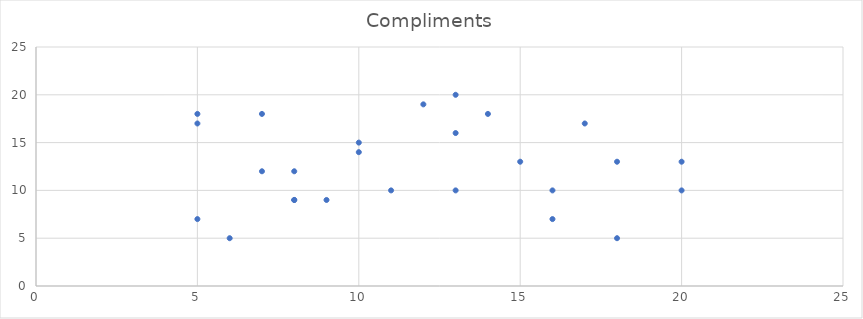
| Category | Compliments |
|---|---|
| 16.0 | 10 |
| 5.0 | 7 |
| 20.0 | 10 |
| 13.0 | 16 |
| 5.0 | 18 |
| 15.0 | 13 |
| 8.0 | 9 |
| 12.0 | 19 |
| 16.0 | 7 |
| 11.0 | 10 |
| 6.0 | 5 |
| 10.0 | 15 |
| 18.0 | 5 |
| 9.0 | 9 |
| 20.0 | 13 |
| 14.0 | 18 |
| 8.0 | 12 |
| 13.0 | 20 |
| 13.0 | 10 |
| 7.0 | 18 |
| 10.0 | 14 |
| 8.0 | 9 |
| 17.0 | 17 |
| 7.0 | 12 |
| 18.0 | 13 |
| 5.0 | 17 |